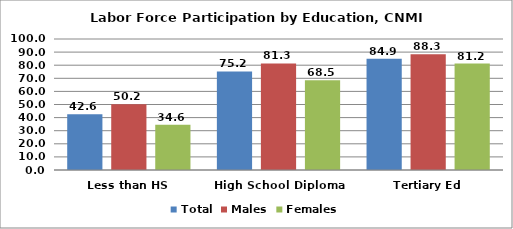
| Category | Total | Males | Females |
|---|---|---|---|
| Less than HS | 42.597 | 50.195 | 34.627 |
| High School Diploma | 75.219 | 81.337 | 68.505 |
| Tertiary Ed | 84.854 | 88.322 | 81.247 |